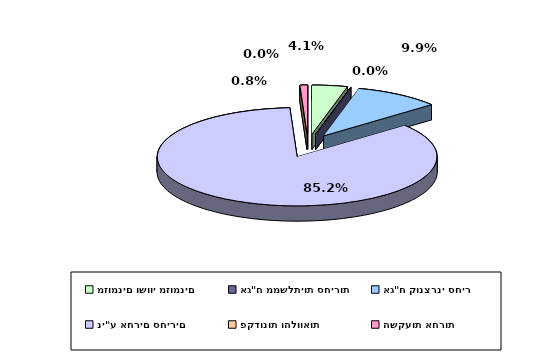
| Category | Series 0 |
|---|---|
| מזומנים ושווי מזומנים | 0.041 |
| אג"ח ממשלתיות סחירות | 0 |
| אג"ח קונצרני סחיר | 0.099 |
| ני"ע אחרים סחירים | 0.852 |
| פקדונות והלוואות | 0 |
| השקעות אחרות | 0.008 |